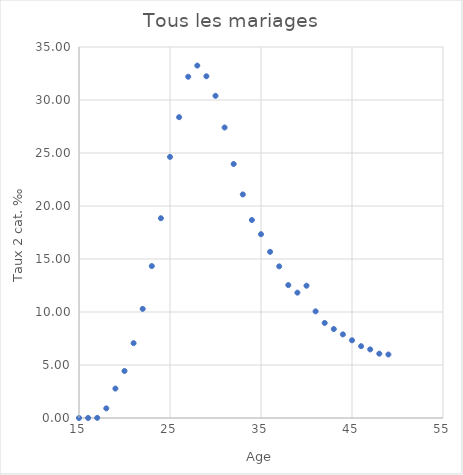
| Category | Tous les mariages |
|---|---|
| 15.0 | 0.003 |
| 16.0 | 0.003 |
| 17.0 | 0.013 |
| 18.0 | 0.908 |
| 19.0 | 2.776 |
| 20.0 | 4.435 |
| 21.0 | 7.061 |
| 22.0 | 10.296 |
| 23.0 | 14.334 |
| 24.0 | 18.847 |
| 25.0 | 24.632 |
| 26.0 | 28.38 |
| 27.0 | 32.193 |
| 28.0 | 33.247 |
| 29.0 | 32.239 |
| 30.0 | 30.394 |
| 31.0 | 27.406 |
| 32.0 | 23.963 |
| 33.0 | 21.091 |
| 34.0 | 18.677 |
| 35.0 | 17.339 |
| 36.0 | 15.675 |
| 37.0 | 14.306 |
| 38.0 | 12.54 |
| 39.0 | 11.825 |
| 40.0 | 12.479 |
| 41.0 | 10.061 |
| 42.0 | 8.968 |
| 43.0 | 8.392 |
| 44.0 | 7.888 |
| 45.0 | 7.331 |
| 46.0 | 6.776 |
| 47.0 | 6.471 |
| 48.0 | 6.068 |
| 49.0 | 5.99 |